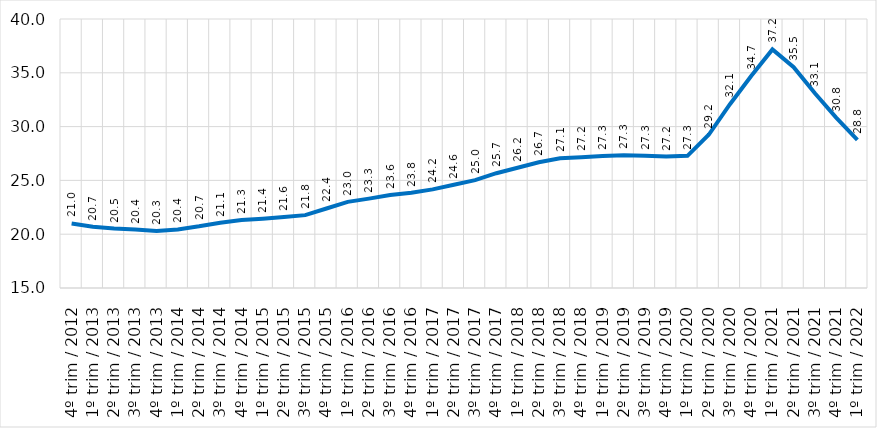
| Category | Series 0 |
|---|---|
| 4º trim / 2012 | 20.998 |
| 1º trim / 2013 | 20.691 |
| 2º trim / 2013 | 20.522 |
| 3º trim / 2013 | 20.431 |
| 4º trim / 2013 | 20.293 |
| 1º trim / 2014 | 20.447 |
| 2º trim / 2014 | 20.733 |
| 3º trim / 2014 | 21.067 |
| 4º trim / 2014 | 21.314 |
| 1º trim / 2015 | 21.443 |
| 2º trim / 2015 | 21.596 |
| 3º trim / 2015 | 21.772 |
| 4º trim / 2015 | 22.39 |
| 1º trim / 2016 | 23.006 |
| 2º trim / 2016 | 23.305 |
| 3º trim / 2016 | 23.641 |
| 4º trim / 2016 | 23.847 |
| 1º trim / 2017 | 24.165 |
| 2º trim / 2017 | 24.601 |
| 3º trim / 2017 | 25.021 |
| 4º trim / 2017 | 25.668 |
| 1º trim / 2018 | 26.17 |
| 2º trim / 2018 | 26.685 |
| 3º trim / 2018 | 27.051 |
| 4º trim / 2018 | 27.161 |
| 1º trim / 2019 | 27.265 |
| 2º trim / 2019 | 27.328 |
| 3º trim / 2019 | 27.301 |
| 4º trim / 2019 | 27.219 |
| 1º trim / 2020 | 27.281 |
| 2º trim / 2020 | 29.241 |
| 3º trim / 2020 | 32.084 |
| 4º trim / 2020 | 34.695 |
| 1º trim / 2021 | 37.17 |
| 2º trim / 2021 | 35.517 |
| 3º trim / 2021 | 33.093 |
| 4º trim / 2021 | 30.835 |
| 1º trim / 2022 | 28.765 |